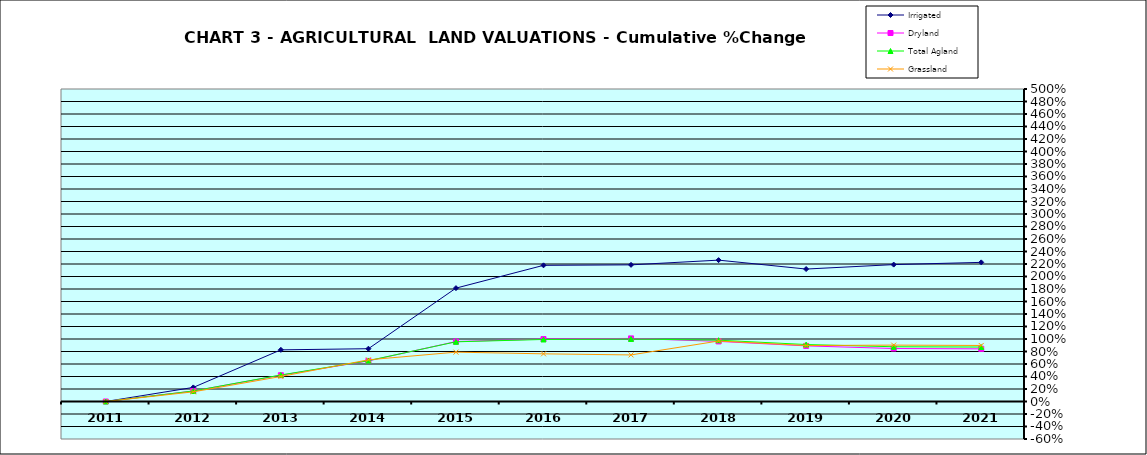
| Category | Irrigated | Dryland | Total Agland | Grassland |
|---|---|---|---|---|
| 2011.0 | 0 | 0 | 0 | 0 |
| 2012.0 | 0.225 | 0.168 | 0.168 | 0.155 |
| 2013.0 | 0.826 | 0.421 | 0.424 | 0.4 |
| 2014.0 | 0.845 | 0.649 | 0.654 | 0.667 |
| 2015.0 | 1.814 | 0.959 | 0.955 | 0.79 |
| 2016.0 | 2.179 | 0.999 | 0.993 | 0.763 |
| 2017.0 | 2.186 | 1.01 | 1 | 0.745 |
| 2018.0 | 2.262 | 0.962 | 0.981 | 0.968 |
| 2019.0 | 2.119 | 0.89 | 0.911 | 0.896 |
| 2020.0 | 2.19 | 0.848 | 0.876 | 0.902 |
| 2021.0 | 2.226 | 0.842 | 0.871 | 0.897 |